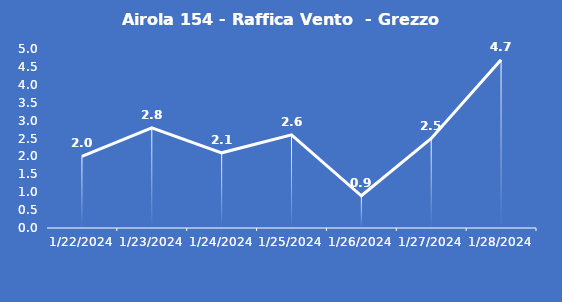
| Category | Airola 154 - Raffica Vento  - Grezzo (m/s) |
|---|---|
| 1/22/24 | 2 |
| 1/23/24 | 2.8 |
| 1/24/24 | 2.1 |
| 1/25/24 | 2.6 |
| 1/26/24 | 0.9 |
| 1/27/24 | 2.5 |
| 1/28/24 | 4.7 |